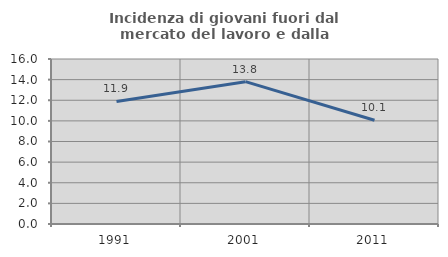
| Category | Incidenza di giovani fuori dal mercato del lavoro e dalla formazione  |
|---|---|
| 1991.0 | 11.886 |
| 2001.0 | 13.803 |
| 2011.0 | 10.056 |